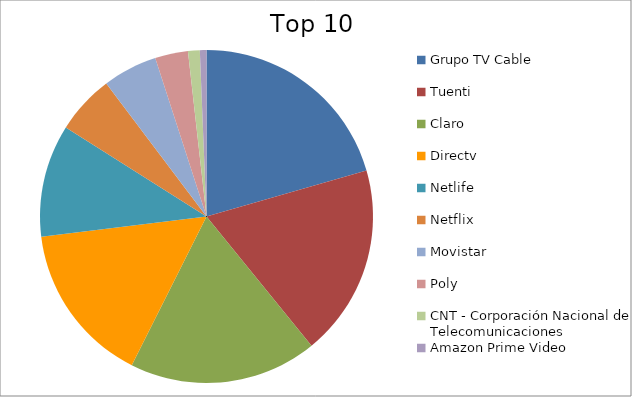
| Category | Series 0 |
|---|---|
| Grupo TV Cable | 20.54 |
| Tuenti | 18.6 |
| Claro | 18.27 |
| Directv | 15.65 |
| Netlife | 10.92 |
| Netflix | 5.74 |
| Movistar | 5.3 |
| Poly | 3.2 |
| CNT - Corporación Nacional de Telecomunicaciones | 1.14 |
| Amazon Prime Video | 0.64 |